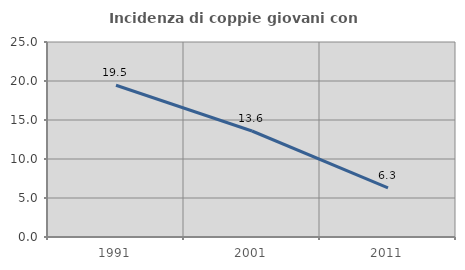
| Category | Incidenza di coppie giovani con figli |
|---|---|
| 1991.0 | 19.452 |
| 2001.0 | 13.59 |
| 2011.0 | 6.304 |